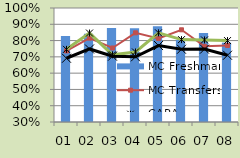
| Category | MC Freshman |
|---|---|
| 01 | 0.828 |
| 02 | 0.843 |
| 03 | 0.878 |
| 04 | 0.875 |
| 05 | 0.888 |
| 06 | 0.804 |
| 07 | 0.847 |
| 08 | 0.787 |